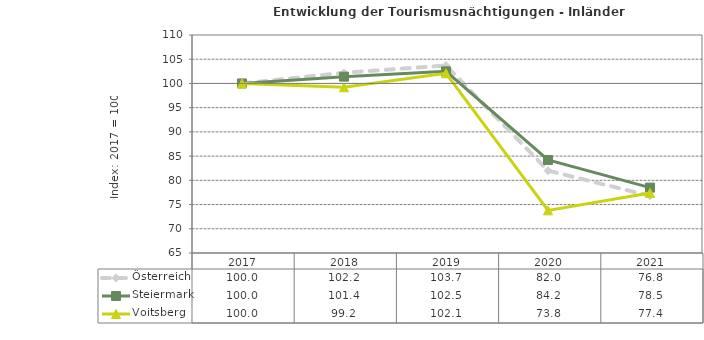
| Category | Österreich | Steiermark | Voitsberg |
|---|---|---|---|
| 2021.0 | 76.8 | 78.5 | 77.4 |
| 2020.0 | 82 | 84.2 | 73.8 |
| 2019.0 | 103.7 | 102.5 | 102.1 |
| 2018.0 | 102.2 | 101.4 | 99.2 |
| 2017.0 | 100 | 100 | 100 |